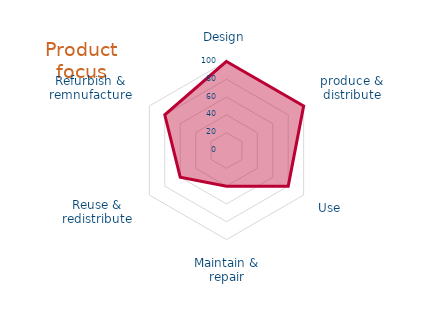
| Category | Fit your product/ service  |
|---|---|
| 0 | 100 |
| 1 | 100 |
| 2 | 80 |
| 3 | 40 |
| 4 | 60 |
| 5 | 80 |